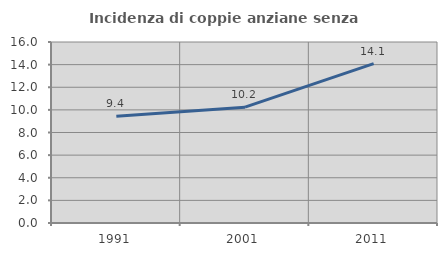
| Category | Incidenza di coppie anziane senza figli  |
|---|---|
| 1991.0 | 9.428 |
| 2001.0 | 10.241 |
| 2011.0 | 14.092 |